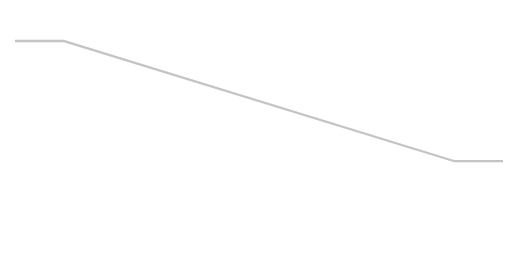
| Category | S1 | S2 | S3 |
|---|---|---|---|
| 0.0 | 200 | 20 | 1710 |
| 10.0 | 200 | 20 | 1710 |
| 90.0 | 1170 | 20 | 740 |
| 100.0 | 1170 | 20 | 740 |